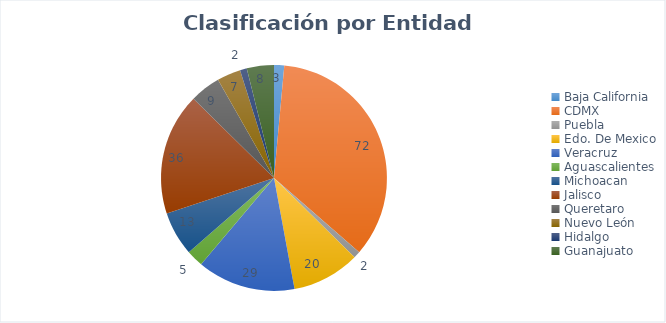
| Category | Series 0 |
|---|---|
| Baja California | 3 |
| CDMX | 72 |
| Puebla | 2 |
| Edo. De Mexico | 20 |
| Veracruz | 29 |
| Aguascalientes | 5 |
| Michoacan | 13 |
| Jalisco | 36 |
| Queretaro | 9 |
| Nuevo León | 7 |
| Hidalgo | 2 |
| Guanajuato | 8 |